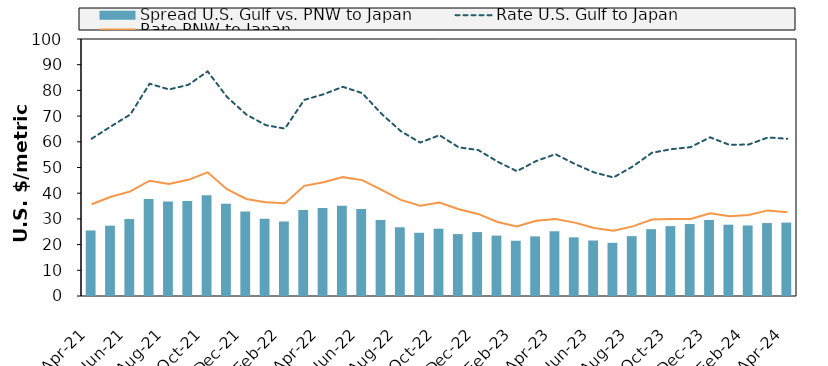
| Category | Spread |
|---|---|
| 2021-04-01 | 25.5 |
| 2021-05-01 | 27.37 |
| 2021-06-01 | 29.94 |
| 2021-07-01 | 37.75 |
| 2021-08-01 | 36.75 |
| 2021-09-01 | 36.95 |
| 2021-10-01 | 39.25 |
| 2021-11-01 | 35.92 |
| 2021-12-01 | 32.88 |
| 2022-01-01 | 30.06 |
| 2022-02-01 | 29 |
| 2022-03-01 | 33.45 |
| 2022-04-01 | 34.25 |
| 2022-05-01 | 35.13 |
| 2022-06-01 | 33.85 |
| 2022-07-01 | 29.57 |
| 2022-08-01 | 26.75 |
| 2022-09-01 | 24.6 |
| 2022-10-01 | 26.18 |
| 2022-11-01 | 24.08 |
| 2022-12-01 | 24.87 |
| 2023-01-01 | 23.5 |
| 2023-02-01 | 21.5 |
| 2023-03-01 | 23.2 |
| 2023-04-01 | 25.19 |
| 2023-05-01 | 22.82 |
| 2023-06-01 | 21.6 |
| 2023-07-01 | 20.69 |
| 2023-08-01 | 23.3 |
| 2023-09-01 | 26 |
| 2023-10-01 | 27.188 |
| 2023-11-01 | 28 |
| 2023-12-01 | 29.58 |
| 2024-01-01 | 27.75 |
| 2024-02-01 | 27.45 |
| 2024-03-01 | 28.38 |
| 2024-04-01 | 28.56 |